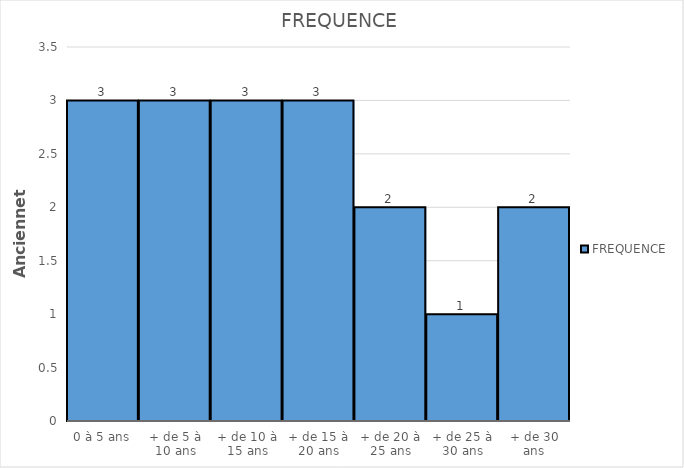
| Category | FREQUENCE |
|---|---|
| 0 à 5 ans | 3 |
| + de 5 à 10 ans | 3 |
| + de 10 à 15 ans | 3 |
| + de 15 à 20 ans | 3 |
| + de 20 à 25 ans | 2 |
| + de 25 à 30 ans | 1 |
| + de 30 ans | 2 |